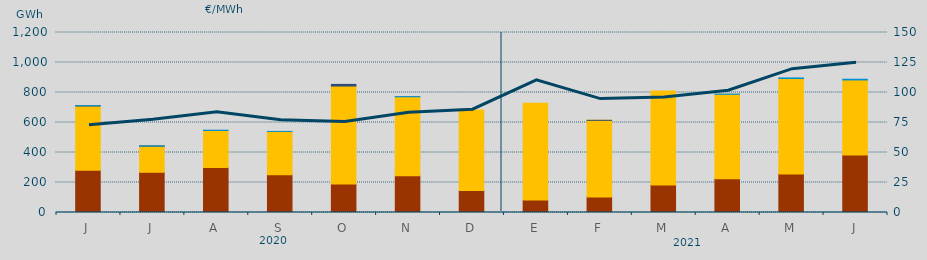
| Category | Carbón | Ciclo Combinado | Consumo Bombeo | Cogeneración | Hidráulica |
|---|---|---|---|---|---|
| J | 281442 | 429259.5 | 370 | 0 | 680 |
| J | 268136 | 174851.8 | 11.5 | 0 | 1020 |
| A | 300478 | 246096.4 | 0 | 0 | 2161.8 |
| S | 250957 | 289538.3 | 0 | 0 | 33.4 |
| O | 189825 | 653476.1 | 10686 | 0 | 0 |
| N | 244862 | 526555 | 0 | 0 | 1376.6 |
| D | 145998 | 537825.1 | 0 | 0 | 0 |
| E | 82898 | 644611.7 | 0 | 0 | 0 |
| F | 103840 | 510673.9 | 0 | 28 | 0 |
| M | 182851 | 627886.9 | 0 | 0 | 0 |
| A | 225243 | 562620.7 | 0 | 0 | 1232 |
| M | 257359 | 635666.9 | 0 | 0 | 3977.2 |
| J | 383637 | 499983.7 | 0 | 0 | 4778.5 |